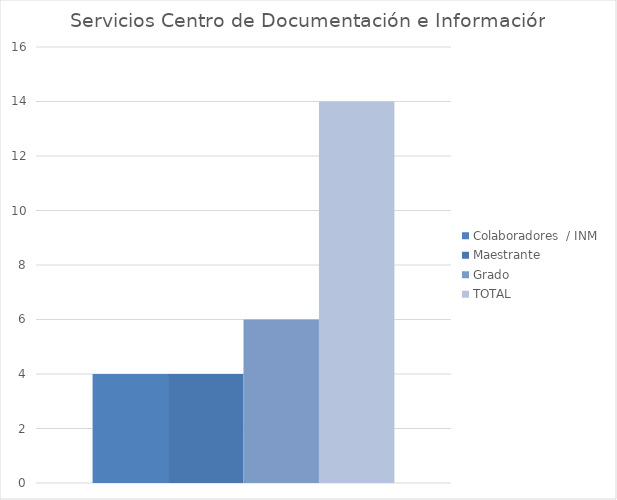
| Category | Colaboradores  / INM | Maestrante | Grado | TOTAL  |
|---|---|---|---|---|
| 0 | 4 | 4 | 6 | 14 |